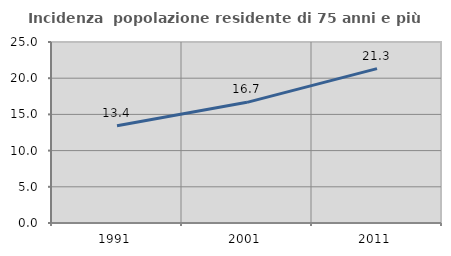
| Category | Incidenza  popolazione residente di 75 anni e più |
|---|---|
| 1991.0 | 13.441 |
| 2001.0 | 16.667 |
| 2011.0 | 21.32 |